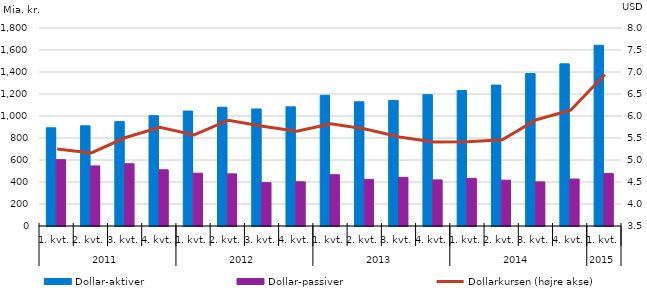
| Category | Dollar-aktiver | Dollar-passiver |
|---|---|---|
| 0 | 893 | 603 |
| 1 | 911 | 546 |
| 2 | 949 | 566 |
| 3 | 1003 | 511 |
| 4 | 1045 | 480 |
| 5 | 1080 | 474 |
| 6 | 1064 | 394 |
| 7 | 1083 | 402 |
| 8 | 1188 | 466 |
| 9 | 1129 | 424 |
| 10 | 1142 | 442 |
| 11 | 1194 | 419 |
| 12 | 1232 | 433 |
| 13 | 1281 | 417 |
| 14 | 1386 | 401 |
| 15 | 1474 | 427 |
| 16 | 1643 | 477 |